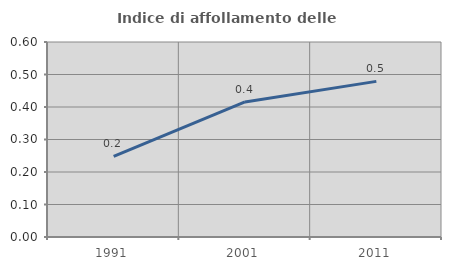
| Category | Indice di affollamento delle abitazioni  |
|---|---|
| 1991.0 | 0.248 |
| 2001.0 | 0.416 |
| 2011.0 | 0.479 |